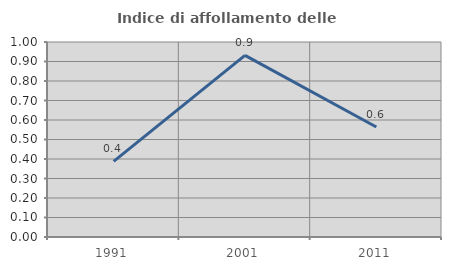
| Category | Indice di affollamento delle abitazioni  |
|---|---|
| 1991.0 | 0.388 |
| 2001.0 | 0.931 |
| 2011.0 | 0.564 |